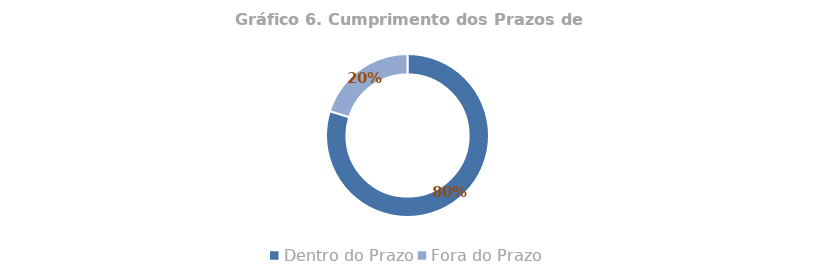
| Category | Total |
|---|---|
| Dentro do Prazo | 0.798 |
| Fora do Prazo | 0.202 |